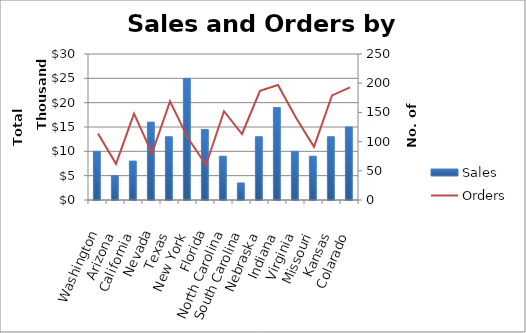
| Category | Sales |
|---|---|
| Washington | 10000 |
| Arizona | 5000 |
| California | 8000 |
| Nevada | 16000 |
| Texas | 13000 |
| New York | 25000 |
| Florida | 14500 |
| North Carolina | 9000 |
| South Carolina | 3500 |
| Nebraska | 13000 |
| Indiana | 19000 |
| Virginia | 10000 |
| Missouri | 9000 |
| Kansas | 13000 |
| Colarado | 15000 |